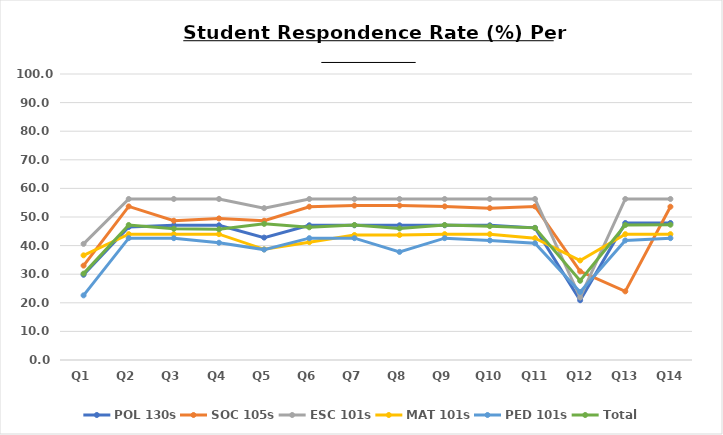
| Category | POL 130s | SOC 105s | ESC 101s | MAT 101s | PED 101s | Total |
|---|---|---|---|---|---|---|
| Q1 | 29.8 | 33 | 40.6 | 36.6 | 22.6 | 30.2 |
| Q2 | 46.5 | 53.7 | 56.3 | 44 | 42.6 | 47.2 |
| Q3 | 47.1 | 48.7 | 56.3 | 44 | 42.6 | 45.9 |
| Q4 | 47.1 | 49.5 | 56.3 | 44 | 41 | 45.7 |
| Q5 | 42.8 | 48.7 | 53.1 | 38.7 | 38.6 | 47.6 |
| Q6 | 47.1 | 53.6 | 56.3 | 41.2 | 42.6 | 46.4 |
| Q7 | 47.1 | 54 | 56.3 | 43.7 | 42.6 | 47.2 |
| Q8 | 47.1 | 54 | 56.3 | 43.7 | 37.8 | 46 |
| Q9 | 47.1 | 53.7 | 56.3 | 44 | 42.6 | 47.2 |
| Q10 | 47.1 | 53.1 | 56.3 | 44 | 41.8 | 46.8 |
| Q11 | 46.2 | 53.7 | 56.3 | 42.6 | 40.8 | 46.2 |
| Q12 | 20.9 | 31 | 21.9 | 34.8 | 23.8 | 27.7 |
| Q13 | 47.9 | 24 | 56.3 | 44 | 41.8 | 47.2 |
| Q14 | 47.9 | 53.6 | 56.3 | 44 | 42.6 | 47.3 |